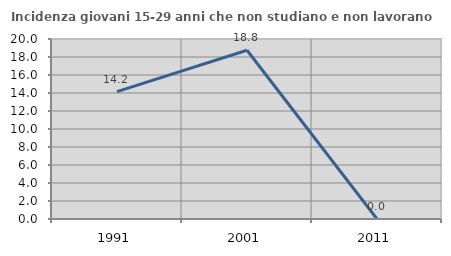
| Category | Incidenza giovani 15-29 anni che non studiano e non lavorano  |
|---|---|
| 1991.0 | 14.155 |
| 2001.0 | 18.75 |
| 2011.0 | 0 |